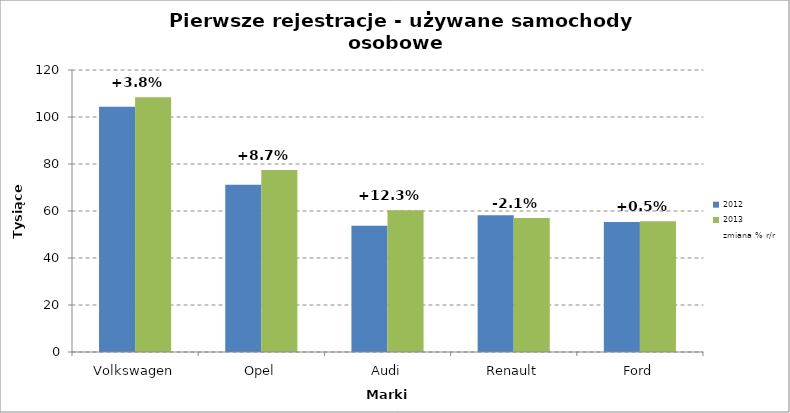
| Category | 2012 | 2013 |
|---|---|---|
| Volkswagen | 104.4 | 108.4 |
| Opel | 71.2 | 77.4 |
| Audi | 53.7 | 60.3 |
| Renault | 58.2 | 57 |
| Ford | 55.3 | 55.6 |